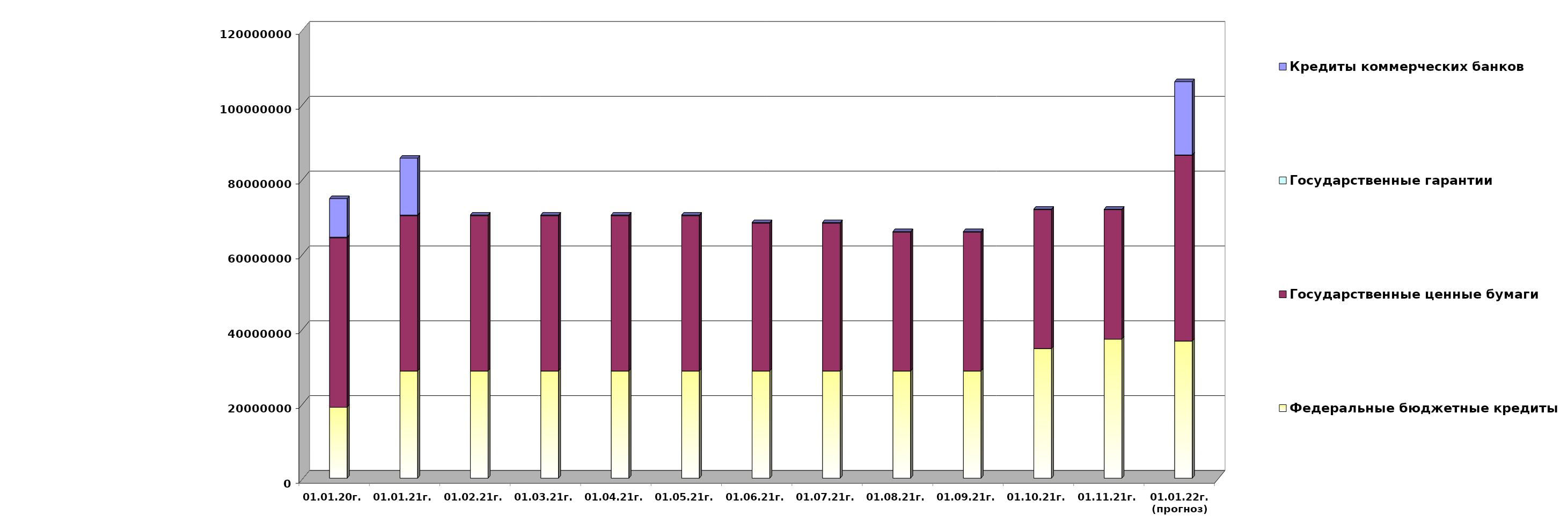
| Category | Федеральные бюджетные кредиты | Государственные ценные бумаги  | Государственные гарантии | Кредиты коммерческих банков |
|---|---|---|---|---|
| 01.01.20г. | 18954967.463 | 45300000 | 186330.02 | 10291177 |
| 01.01.21г. | 28654967.463 | 41500000 | 184738.25 | 15190000 |
| 01.02.21г. | 28654967.463 | 41500000 | 182966.25 | 0 |
| 01.03.21г. | 28654967.463 | 41500000 | 182966.25 | 0 |
| 01.04.21г. | 28654967.463 | 41500000 | 182966.25 | 0 |
| 01.05.21г. | 28654967.463 | 41500000 | 174735.46 | 0 |
| 01.06.21г. | 28654967.463 | 39500000 | 174735.46 | 0 |
| 01.07.21г. | 28654967.463 | 39500000 | 174735.46 | 0 |
| 01.08.21г. | 28654967.463 | 37100000 | 158212.22 | 0 |
| 01.09.21г. | 28654967.463 | 37100000 | 158212.22 | 0 |
| 01.10.21г. | 34649676.663 | 37100000 | 158212.22 | 0 |
| 01.11.21г. | 37149676.663 | 34600000 | 141570.67 | 0 |
| 01.01.22г.
(прогноз) | 36662617.9 | 49600000 | 141570.7 | 19584060.8 |